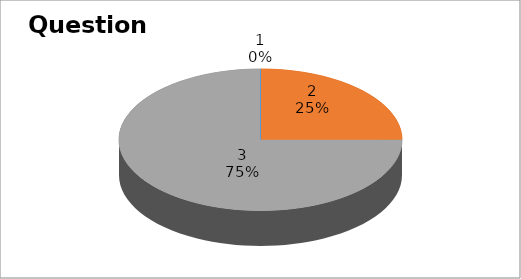
| Category | Series 0 |
|---|---|
| 0 | 0 |
| 1 | 2 |
| 2 | 6 |